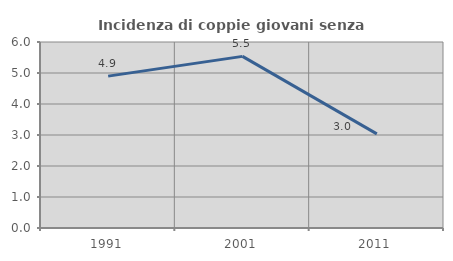
| Category | Incidenza di coppie giovani senza figli |
|---|---|
| 1991.0 | 4.899 |
| 2001.0 | 5.537 |
| 2011.0 | 3.035 |